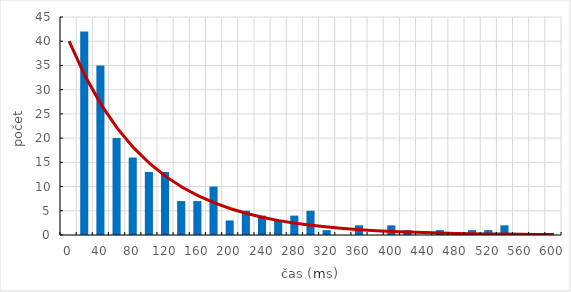
| Category | Series 0 |
|---|---|
| 0.0 | 0 |
| 20.0 | 42 |
| 40.0 | 35 |
| 60.0 | 20 |
| 80.0 | 16 |
| 100.0 | 13 |
| 120.0 | 13 |
| 140.0 | 7 |
| 160.0 | 7 |
| 180.0 | 10 |
| 200.0 | 3 |
| 220.0 | 5 |
| 240.0 | 4 |
| 260.0 | 3 |
| 280.0 | 4 |
| 300.0 | 5 |
| 320.0 | 1 |
| 340.0 | 0 |
| 360.0 | 2 |
| 380.0 | 0 |
| 400.0 | 2 |
| 420.0 | 1 |
| 440.0 | 0 |
| 460.0 | 1 |
| 480.0 | 0 |
| 500.0 | 1 |
| 520.0 | 1 |
| 540.0 | 2 |
| 560.0 | 0 |
| 580.0 | 0 |
| 600.0 | 0 |